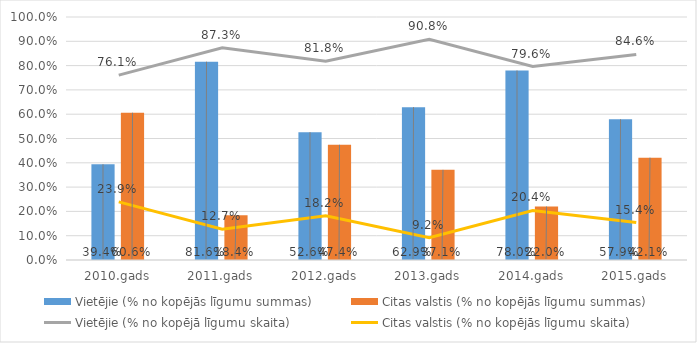
| Category | Līgumu skaits | Noslēgto līgumu summa, milj.EUR |
|---|---|---|
| Latvija | 231 | 212.9 |
| Citas Eiropas Savienības valstis | 38 | 149.8 |
| Citas valstis | 4 | 4.9 |